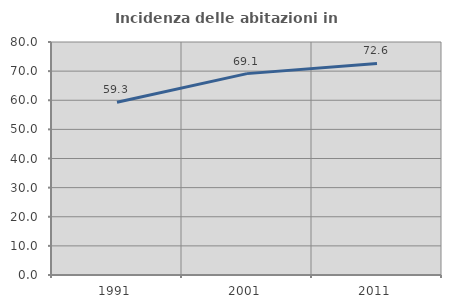
| Category | Incidenza delle abitazioni in proprietà  |
|---|---|
| 1991.0 | 59.314 |
| 2001.0 | 69.142 |
| 2011.0 | 72.624 |